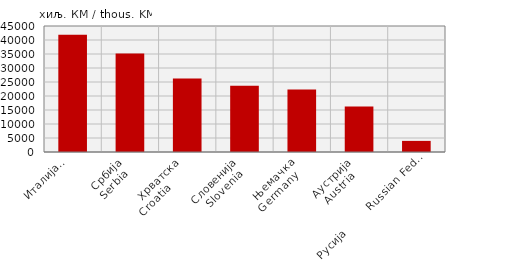
| Category | Извоз
Export |
|---|---|
| Италија
Italy  | 41872 |
| Србија
Serbia  | 35194 |
| Хрватска
Croatia        | 26269 |
| Словенија
Slovenia  | 23680 |
| Њемачка
Germany   | 22333 |
| Аустрија
Austria   | 16280 |
| Русија        Russian Federation | 3969 |